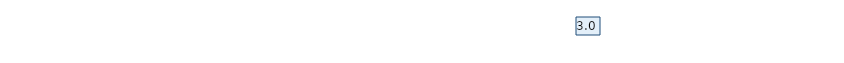
| Category | Итоговая оценка |
|---|---|
| Вопрос 5 | 3 |